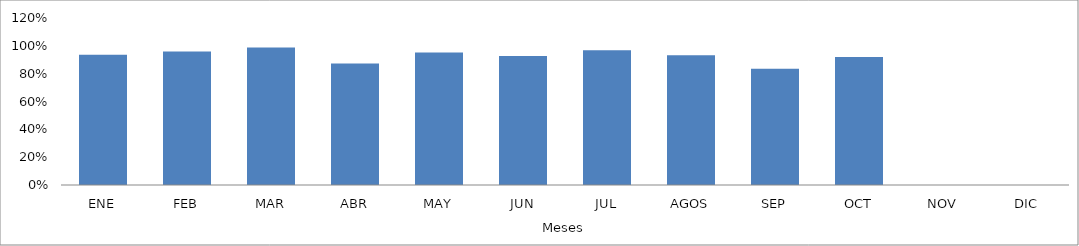
| Category | Series 0 |
|---|---|
| ENE | 0.936 |
| FEB | 0.96 |
| MAR | 0.987 |
| ABR | 0.874 |
| MAY | 0.953 |
| JUN | 0.927 |
| JUL | 0.968 |
| AGOS | 0.931 |
| SEP | 0.836 |
| OCT | 0.919 |
| NOV | 0 |
| DIC | 0 |